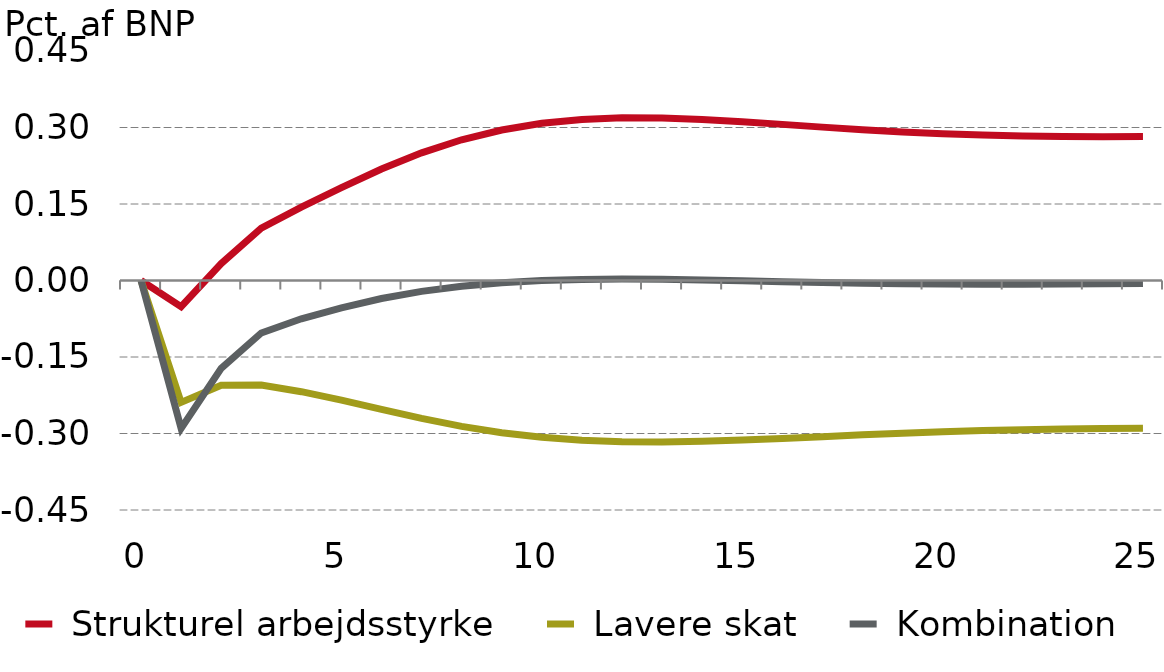
| Category |  Strukturel arbejdsstyrke |  Lavere skat |  Kombination |
|---|---|---|---|
| 0.0 | 0 | 0 | 0 |
| nan | -0.051 | -0.239 | -0.29 |
| nan | 0.033 | -0.205 | -0.172 |
| nan | 0.103 | -0.205 | -0.103 |
| nan | 0.144 | -0.218 | -0.075 |
| 5.0 | 0.182 | -0.235 | -0.054 |
| nan | 0.219 | -0.253 | -0.035 |
| nan | 0.25 | -0.27 | -0.021 |
| nan | 0.276 | -0.286 | -0.011 |
| nan | 0.295 | -0.298 | -0.004 |
| 10.0 | 0.308 | -0.307 | 0 |
| nan | 0.316 | -0.313 | 0.002 |
| nan | 0.319 | -0.316 | 0.003 |
| nan | 0.319 | -0.317 | 0.002 |
| nan | 0.316 | -0.315 | 0.001 |
| 15.0 | 0.311 | -0.313 | -0.001 |
| nan | 0.306 | -0.31 | -0.002 |
| nan | 0.301 | -0.306 | -0.004 |
| nan | 0.296 | -0.303 | -0.005 |
| nan | 0.291 | -0.299 | -0.006 |
| 20.0 | 0.288 | -0.297 | -0.007 |
| nan | 0.285 | -0.294 | -0.007 |
| nan | 0.283 | -0.292 | -0.007 |
| nan | 0.282 | -0.291 | -0.007 |
| nan | 0.282 | -0.29 | -0.006 |
| 25.0 | 0.282 | -0.29 | -0.006 |